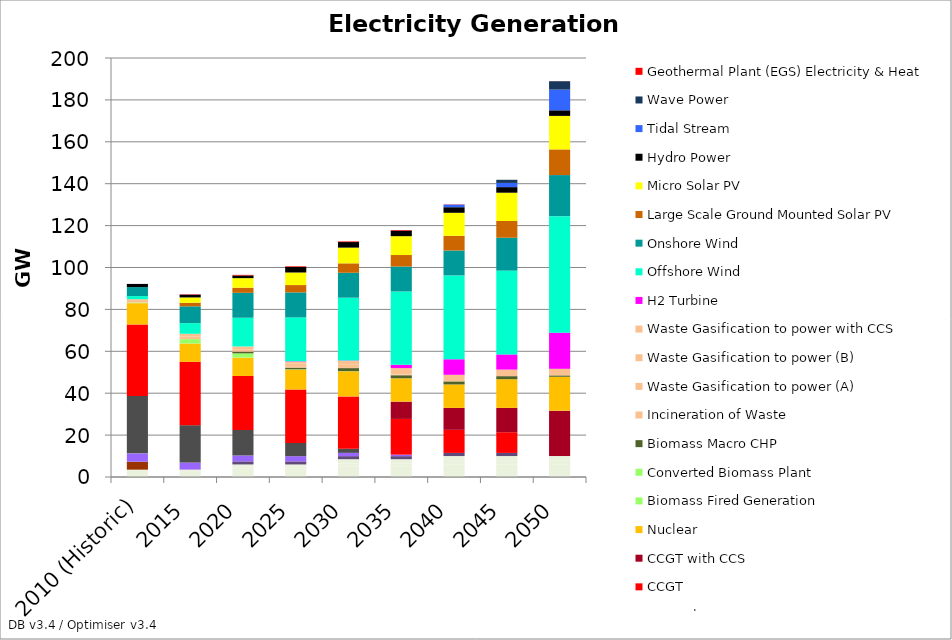
| Category | Interconnector Benelux-Germany (Electricity) | Interconnector France (Electricity) | Interconnector Ireland (Electricity) | Interconnector Nordel (Electricity) | Oil Fired Generation | Gas Macro CHP | OCGT | PC Coal | CCGT | CCGT with CCS | Nuclear | Biomass Fired Generation | Converted Biomass Plant | Biomass Macro CHP | Incineration of Waste | Waste Gasification to power (A) | Waste Gasification to power (B) | Waste Gasification to power with CCS | H2 Turbine | Offshore Wind | Onshore Wind | Large Scale Ground Mounted Solar PV | Micro Solar PV | Hydro Power | Tidal Stream | Wave Power | Geothermal Plant (EGS) Electricity & Heat |
|---|---|---|---|---|---|---|---|---|---|---|---|---|---|---|---|---|---|---|---|---|---|---|---|---|---|---|---|
| 2010 (Historic) | 1 | 2 | 0.5 | 0 | 3.8 | 0 | 3.98 | 27.42 | 34.1 | 0 | 10.17 | 0.3 | 0 | 0 | 1.6 | 0 | 0 | 0 | 0 | 1.49 | 4.3 | 0 | 0 | 1.5 | 0 | 0 | 0 |
| 2015 | 1 | 2 | 0.5 | 0 | 0.066 | 0 | 3.316 | 17.848 | 30.236 | 0 | 8.741 | 0.225 | 1.875 | 0 | 1.2 | 1.365 | 0 | 0 | 0 | 5.085 | 8 | 1.694 | 2.556 | 1.341 | 0 | 0 | 0.176 |
| 2020 | 1 | 3 | 1 | 1 | 0 | 1.46 | 2.824 | 12.195 | 25.75 | 0 | 8.741 | 0.18 | 1.873 | 0.8 | 0.96 | 1.365 | 0.083 | 0.085 | 0 | 13.702 | 11.9 | 2.444 | 4.556 | 1.271 | 0 | 0 | 0.299 |
| 2025 | 1 | 3 | 1 | 1 | 0 | 1.46 | 2.483 | 6.297 | 25.55 | 0 | 9.481 | 0.135 | 0 | 0.8 | 0.72 | 1.365 | 0.083 | 0.652 | 0.191 | 21 | 11.9 | 3.5 | 6 | 2.66 | 0 | 0 | 0.299 |
| 2030 | 1 | 4 | 1.5 | 2 | 0 | 1.46 | 1.562 | 2.006 | 24.927 | 0 | 11.981 | 0.09 | 0 | 1.46 | 0.48 | 1.365 | 0.083 | 1.484 | 0.191 | 30 | 11.9 | 4.5 | 7.5 | 2.66 | 0 | 0 | 0.299 |
| 2035 | 1 | 4 | 1.5 | 2 | 0 | 1.46 | 0.702 | 0 | 17.062 | 8.249 | 11.101 | 0.045 | 0 | 1.46 | 0.24 | 0 | 0.083 | 3.077 | 1.575 | 35 | 11.9 | 5.5 | 9 | 2.66 | 0 | 0 | 0.299 |
| 2040 | 1 | 5 | 2 | 2 | 0 | 1.46 | 0.039 | 0 | 11.015 | 10.474 | 11.191 | 0 | 0 | 1.46 | 0 | 0 | 0 | 3.138 | 7.437 | 40 | 11.9 | 7 | 11 | 2.66 | 1.26 | 0 | 0.124 |
| 2045 | 1 | 5 | 2 | 2 | 0 | 1.46 | 0.039 | 0 | 9.876 | 11.613 | 13.691 | 0 | 0 | 1.46 | 0 | 0 | 0 | 3.138 | 7.246 | 40 | 15.684 | 8 | 13.5 | 2.66 | 2 | 1.5 | 0 |
| 2050 | 1 | 5 | 2 | 2 | 0 | 0 | 0.041 | 0 | 0 | 21.613 | 16.19 | 0 | 0 | 0.66 | 0 | 0 | 0 | 3.138 | 17.246 | 55.627 | 19.606 | 12.25 | 16 | 2.66 | 9.887 | 4 | 0.038 |